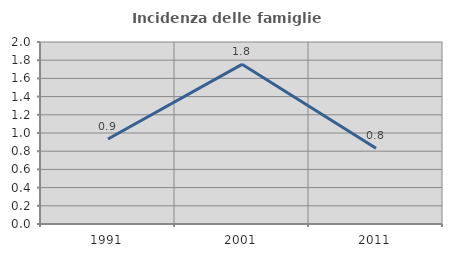
| Category | Incidenza delle famiglie numerose |
|---|---|
| 1991.0 | 0.935 |
| 2001.0 | 1.754 |
| 2011.0 | 0.833 |